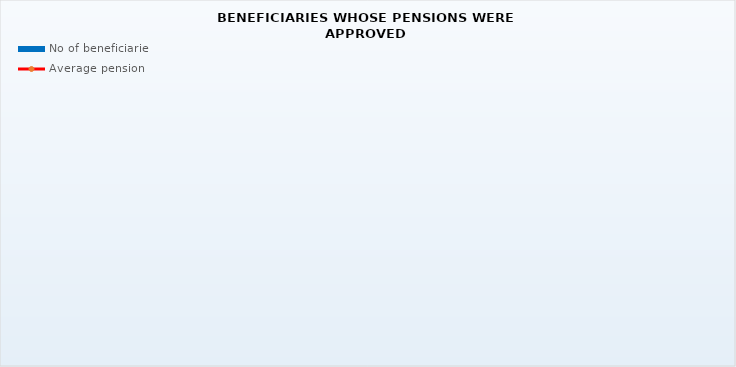
| Category | No of beneficiaries |
|---|---|
| Authorised officials in internal affairs, judicial officers and workers engaged in demining work: | 17264 |
| Active military personnel - DVO  | 15583 |
| Croatian Homeland Army veterans mobilised from 1941 to 1945 | 4368 |
| Former political prisoners | 2882 |
| Croatian Veterans from the Homeland War - ZOHBDR (Act on the Rights of Croatian Homeland War Veterans and their Family Members) | 71225 |
| Pensions approved under general regulations and determined according to the Act on the Rights of Croatian Homeland War Veterans and their Family Members (ZOHBDR), in 2017 (Art. 27, 35, 48 and 49, paragraph 2)    | 40993 |
| Former Yugoslav People's Army members - JNA   | 5627 |
| Former Yugoslav People's Army members - JNA - Art. 185 of Pension Insurance Act (ZOMO)  | 139 |
| National Liberation War veterans - NOR | 10289 |
| Members of the Croatian Parliament, members of the Government, judges of the Constitutional Court and the Auditor General | 669 |
| Members of the Parliamentary Executive Council and administratively retired federal civil servants  (relates to the former SFRY) | 96 |
| Former officials of federal bodies o the former SFRJ -  Article 38 of the Pension Insurance Act (ZOMO) | 34 |
| Full members of the Croatian Academy of Sciences and Arts - HAZU | 142 |
| Miners from the Istrian coal mines "Tupljak" d.d. Labin  | 255 |
| Workers professionally exposed to asbestos | 868 |
| Insurees - crew members on a ship in international and national navigation  - Article  129, paragraph 2 of the Maritime Code | 168 |
| Members of the Croatian Defence Council - HVO  | 6726 |